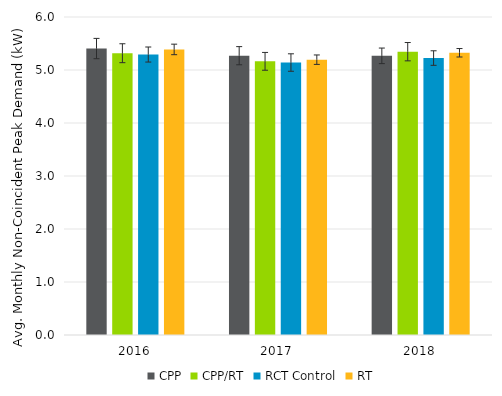
| Category | CPP | CPP/RT | RCT Control | RT |
|---|---|---|---|---|
| 2016.0 | 5.405 | 5.317 | 5.292 | 5.388 |
| 2017.0 | 5.27 | 5.164 | 5.141 | 5.195 |
| 2018.0 | 5.267 | 5.345 | 5.225 | 5.325 |